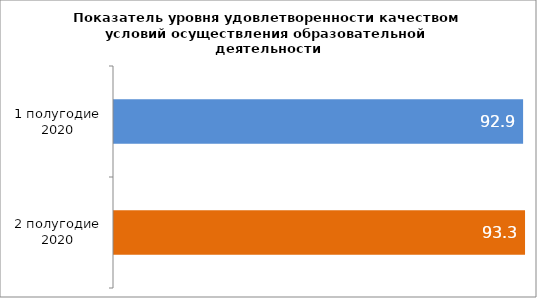
| Category | Series 0 |
|---|---|
| 1 полугодие 2020 | 92.886 |
| 2 полугодие 2020 | 93.327 |